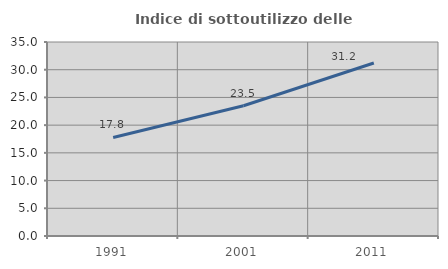
| Category | Indice di sottoutilizzo delle abitazioni  |
|---|---|
| 1991.0 | 17.774 |
| 2001.0 | 23.505 |
| 2011.0 | 31.203 |